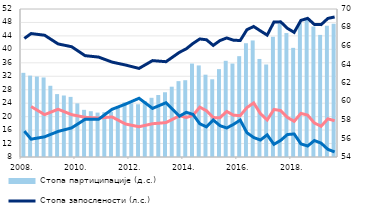
| Category | Стопа партиципације (д.с.) |
|---|---|
| 2008. | 63.1 |
| II | 62.8 |
| III | 62.7 |
| IV | 62.6 |
| 2009. | 61.7 |
| II | 60.8 |
| III | 60.65 |
| IV | 60.5 |
| 2010. | 59.8 |
| II | 59.1 |
| III | 58.95 |
| IV | 58.8 |
| 2011. | 58.85 |
| II | 58.9 |
| III | 59.4 |
| IV | 59.9 |
| 2012. | 59.8 |
| II | 59.7 |
| III | 60.05 |
| IV | 60.4 |
| 2013. | 60.7 |
| II | 61 |
| III | 61.6 |
| IV | 62.2 |
| 2014. | 62.3 |
| II | 64.1 |
| III | 63.9 |
| IV | 62.9 |
| 2015. | 62.4 |
| II | 63.5 |
| III | 64.4 |
| IV | 64.1 |
| 2016. | 64.9 |
| II | 66.3 |
| III | 66.6 |
| IV | 64.6 |
| 2017. | 64 |
| II | 67 |
| III | 68.4 |
| IV | 67.4 |
| 2018. | 65.8 |
| II | 68.5 |
| III | 69 |
| IV | 68.1 |
| 2019. | 67.2 |
| II | 68.2 |
| III | 68.4 |